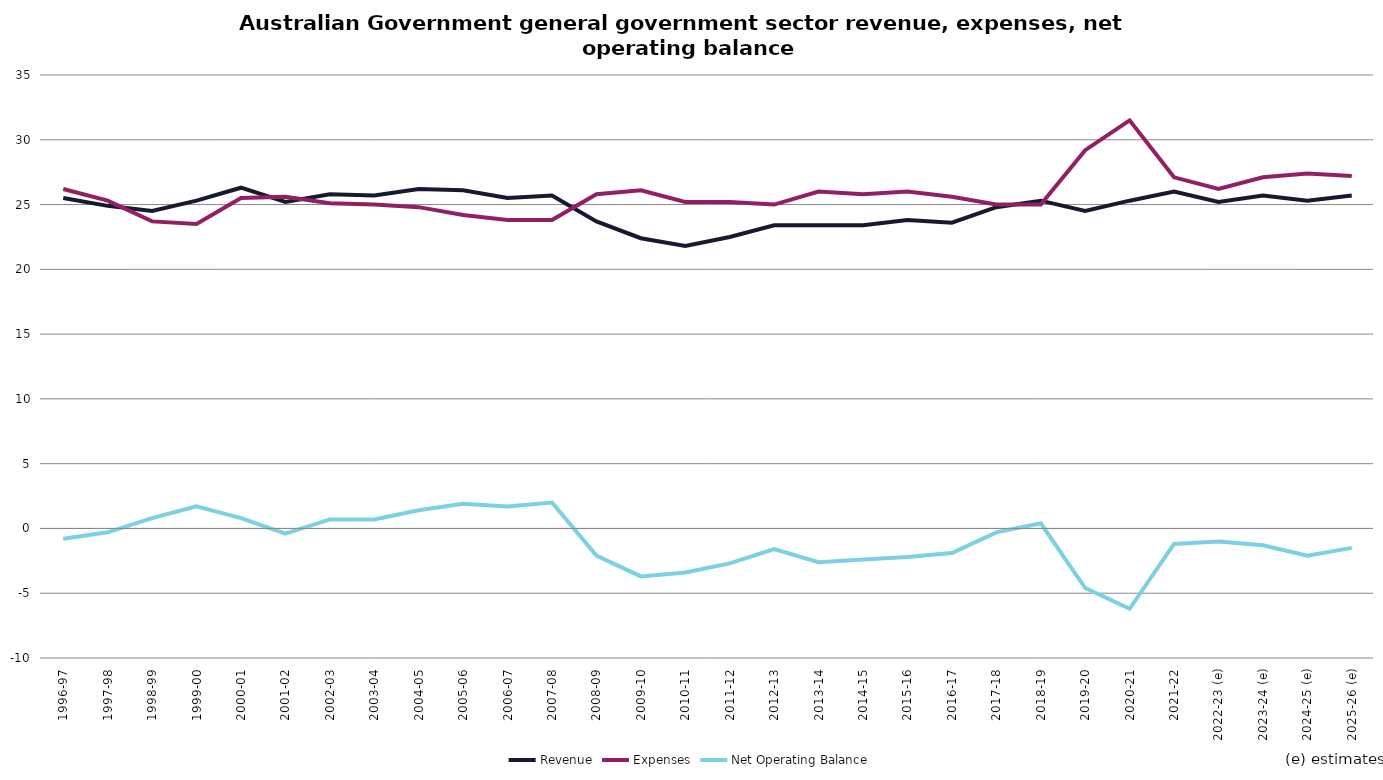
| Category | Revenue | Expenses | Net Operating Balance |
|---|---|---|---|
| 1996-97 | 25.5 | 26.2 | -0.8 |
| 1997-98 | 24.9 | 25.3 | -0.3 |
| 1998-99 | 24.5 | 23.7 | 0.8 |
| 1999-00 | 25.3 | 23.5 | 1.7 |
| 2000-01 | 26.3 | 25.5 | 0.8 |
| 2001-02 | 25.2 | 25.6 | -0.4 |
| 2002-03 | 25.8 | 25.1 | 0.7 |
| 2003-04 | 25.7 | 25 | 0.7 |
| 2004-05 | 26.2 | 24.8 | 1.4 |
| 2005-06 | 26.1 | 24.2 | 1.9 |
| 2006-07 | 25.5 | 23.8 | 1.7 |
| 2007-08 | 25.7 | 23.8 | 2 |
| 2008-09 | 23.7 | 25.8 | -2.1 |
| 2009-10 | 22.4 | 26.1 | -3.7 |
| 2010-11 | 21.8 | 25.2 | -3.4 |
| 2011-12 | 22.5 | 25.2 | -2.7 |
| 2012-13 | 23.4 | 25 | -1.6 |
| 2013-14 | 23.4 | 26 | -2.6 |
| 2014-15 | 23.4 | 25.8 | -2.4 |
| 2015-16 | 23.8 | 26 | -2.2 |
| 2016-17 | 23.6 | 25.6 | -1.9 |
| 2017-18 | 24.8 | 25 | -0.3 |
| 2018-19 | 25.3 | 25 | 0.4 |
| 2019-20 | 24.5 | 29.2 | -4.6 |
| 2020-21 | 25.3 | 31.5 | -6.2 |
| 2021-22 | 26 | 27.1 | -1.2 |
| 2022-23 (e) | 25.2 | 26.2 | -1 |
| 2023-24 (e) | 25.7 | 27.1 | -1.3 |
| 2024-25 (e) | 25.3 | 27.4 | -2.1 |
| 2025-26 (e) | 25.7 | 27.2 | -1.5 |